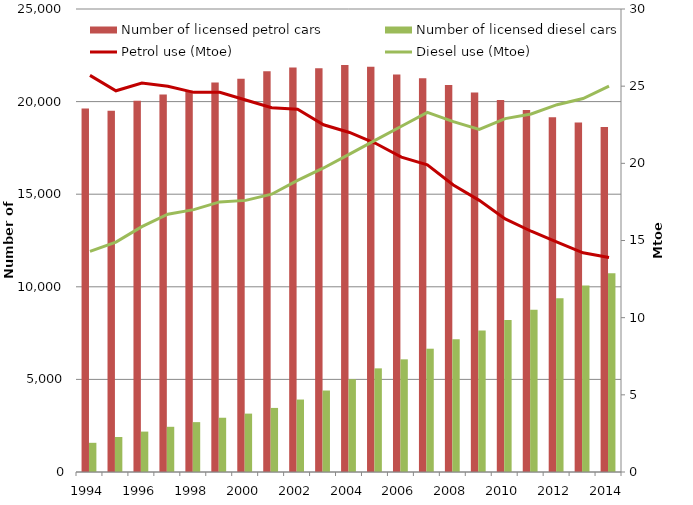
| Category | Number of licensed petrol cars | Number of licensed diesel cars |
|---|---|---|
| 1994.0 | 19620.898 | 1576.196 |
| 1995.0 | 19499.763 | 1891.271 |
| 1996.0 | 20051.602 | 2181.634 |
| 1997.0 | 20384.711 | 2440.508 |
| 1998.0 | 20590.535 | 2692.904 |
| 1999.0 | 21031.016 | 2929.873 |
| 2000.0 | 21232.615 | 3152.708 |
| 2001.0 | 21641.055 | 3459.544 |
| 2002.0 | 21839.475 | 3912.372 |
| 2003.0 | 21805.47 | 4399.608 |
| 2004.0 | 21976.606 | 5010.583 |
| 2005.0 | 21875.999 | 5596.101 |
| 2006.0 | 21465.817 | 6083.318 |
| 2007.0 | 21264.446 | 6657.383 |
| 2008.0 | 20899.138 | 7163.505 |
| 2009.0 | 20491.201 | 7641.42 |
| 2010.0 | 20083.122 | 8202.684 |
| 2011.0 | 19548.481 | 8763.495 |
| 2012.0 | 19158.822 | 9385.119 |
| 2013.0 | 18870.257 | 10064.151 |
| 2014.0 | 18632.596 | 10730.907 |